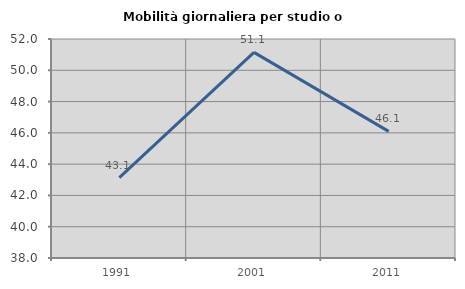
| Category | Mobilità giornaliera per studio o lavoro |
|---|---|
| 1991.0 | 43.142 |
| 2001.0 | 51.144 |
| 2011.0 | 46.097 |